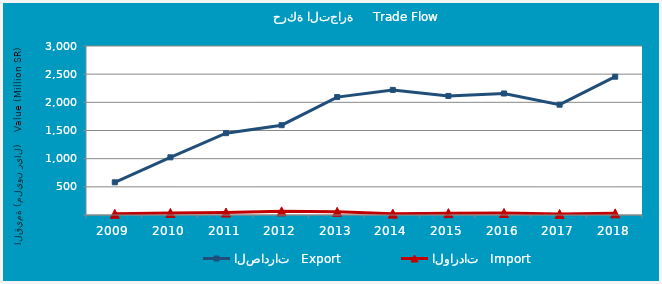
| Category | الصادرات   Export | الواردات   Import |
|---|---|---|
| 2009.0 | 580674904 | 21014216 |
| 2010.0 | 1023712559 | 37371777 |
| 2011.0 | 1452707446 | 44678460 |
| 2012.0 | 1594041365 | 64801981 |
| 2013.0 | 2093150287 | 57184013 |
| 2014.0 | 2220645530 | 23755453 |
| 2015.0 | 2113694029 | 33076585 |
| 2016.0 | 2157029246 | 35941439 |
| 2017.0 | 1958394053 | 17870326 |
| 2018.0 | 2455152349 | 29106109 |